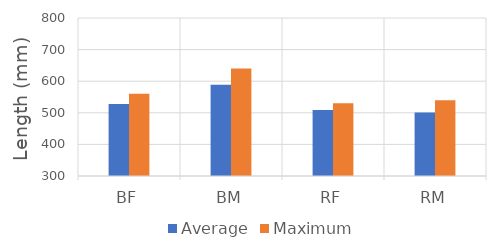
| Category | Average | Maximum |
|---|---|---|
| BF | 528 | 560 |
| BM | 589 | 640 |
| RF | 509 | 530 |
| RM | 501 | 540 |